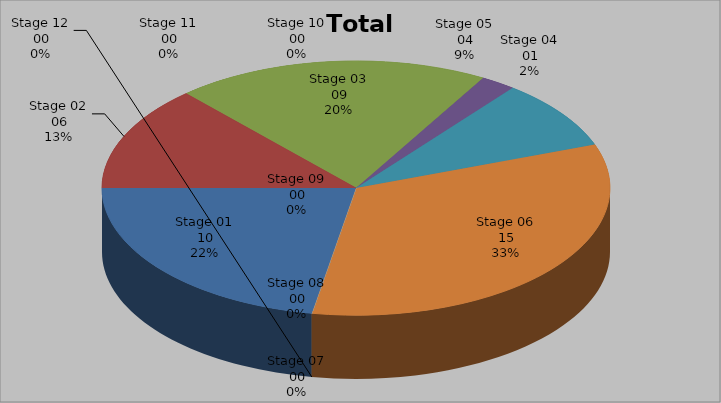
| Category | Series 0 |
|---|---|
| Stage 01 | 10 |
| Stage 02 | 6 |
| Stage 03 | 9 |
| Stage 04 | 1 |
| Stage 05 | 4 |
| Stage 06 | 15 |
| Stage 07 | 0 |
| Stage 08 | 0 |
| Stage 09 | 0 |
| Stage 10 | 0 |
| Stage 11 | 0 |
| Stage 12 | 0 |